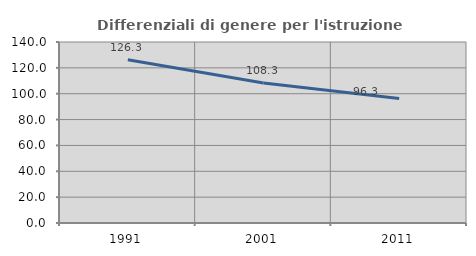
| Category | Differenziali di genere per l'istruzione superiore |
|---|---|
| 1991.0 | 126.272 |
| 2001.0 | 108.332 |
| 2011.0 | 96.347 |